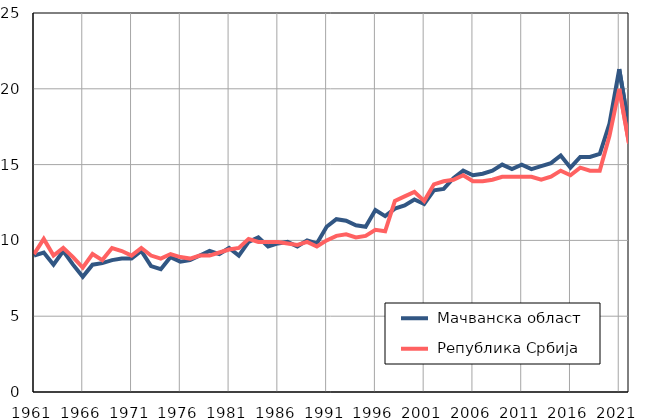
| Category |  Мачванска област |  Република Србија |
|---|---|---|
| 1961.0 | 9 | 9.1 |
| 1962.0 | 9.2 | 10.1 |
| 1963.0 | 8.4 | 9 |
| 1964.0 | 9.3 | 9.5 |
| 1965.0 | 8.4 | 8.9 |
| 1966.0 | 7.6 | 8.2 |
| 1967.0 | 8.4 | 9.1 |
| 1968.0 | 8.5 | 8.7 |
| 1969.0 | 8.7 | 9.5 |
| 1970.0 | 8.8 | 9.3 |
| 1971.0 | 8.8 | 9 |
| 1972.0 | 9.3 | 9.5 |
| 1973.0 | 8.3 | 9 |
| 1974.0 | 8.1 | 8.8 |
| 1975.0 | 8.9 | 9.1 |
| 1976.0 | 8.6 | 8.9 |
| 1977.0 | 8.7 | 8.8 |
| 1978.0 | 9 | 9 |
| 1979.0 | 9.3 | 9 |
| 1980.0 | 9.1 | 9.2 |
| 1981.0 | 9.5 | 9.4 |
| 1982.0 | 9 | 9.5 |
| 1983.0 | 9.9 | 10.1 |
| 1984.0 | 10.2 | 9.9 |
| 1985.0 | 9.6 | 9.9 |
| 1986.0 | 9.8 | 9.9 |
| 1987.0 | 9.9 | 9.8 |
| 1988.0 | 9.6 | 9.7 |
| 1989.0 | 10 | 9.9 |
| 1990.0 | 9.8 | 9.6 |
| 1991.0 | 10.9 | 10 |
| 1992.0 | 11.4 | 10.3 |
| 1993.0 | 11.3 | 10.4 |
| 1994.0 | 11 | 10.2 |
| 1995.0 | 10.9 | 10.3 |
| 1996.0 | 12 | 10.7 |
| 1997.0 | 11.6 | 10.6 |
| 1998.0 | 12.1 | 12.6 |
| 1999.0 | 12.3 | 12.9 |
| 2000.0 | 12.7 | 13.2 |
| 2001.0 | 12.4 | 12.6 |
| 2002.0 | 13.3 | 13.7 |
| 2003.0 | 13.4 | 13.9 |
| 2004.0 | 14.1 | 14 |
| 2005.0 | 14.6 | 14.3 |
| 2006.0 | 14.3 | 13.9 |
| 2007.0 | 14.4 | 13.9 |
| 2008.0 | 14.6 | 14 |
| 2009.0 | 15 | 14.2 |
| 2010.0 | 14.7 | 14.2 |
| 2011.0 | 15 | 14.2 |
| 2012.0 | 14.7 | 14.2 |
| 2013.0 | 14.9 | 14 |
| 2014.0 | 15.1 | 14.2 |
| 2015.0 | 15.6 | 14.6 |
| 2016.0 | 14.8 | 14.3 |
| 2017.0 | 15.5 | 14.8 |
| 2018.0 | 15.5 | 14.6 |
| 2019.0 | 15.7 | 14.6 |
| 2020.0 | 17.7 | 16.9 |
| 2021.0 | 21.3 | 20 |
| 2022.0 | 17.4 | 16.4 |